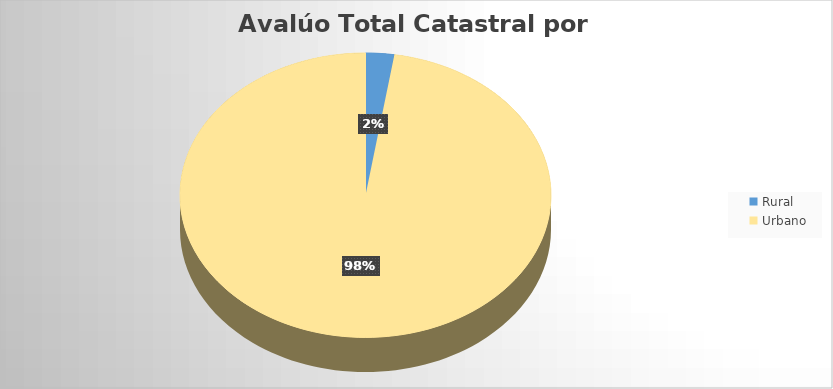
| Category | AvalúoTotal |
|---|---|
| Rural | 2869031604000 |
| Urbano | 112461932715000 |